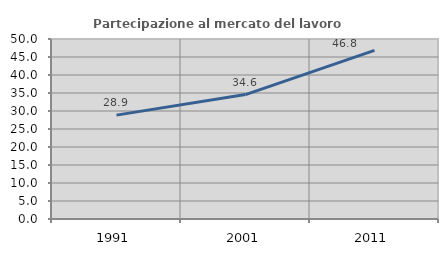
| Category | Partecipazione al mercato del lavoro  femminile |
|---|---|
| 1991.0 | 28.859 |
| 2001.0 | 34.568 |
| 2011.0 | 46.835 |